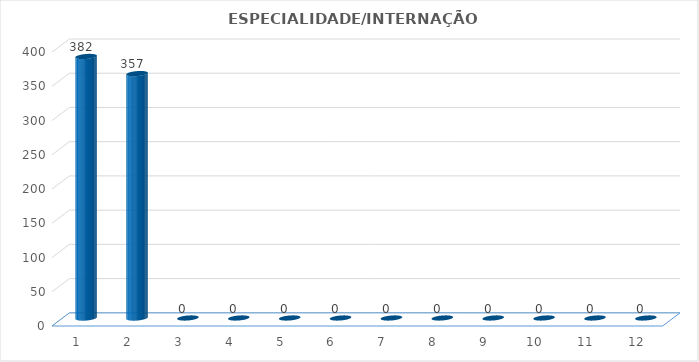
| Category | Series 0 |
|---|---|
| 0 | 382 |
| 1 | 357 |
| 2 | 0 |
| 3 | 0 |
| 4 | 0 |
| 5 | 0 |
| 6 | 0 |
| 7 | 0 |
| 8 | 0 |
| 9 | 0 |
| 10 | 0 |
| 11 | 0 |